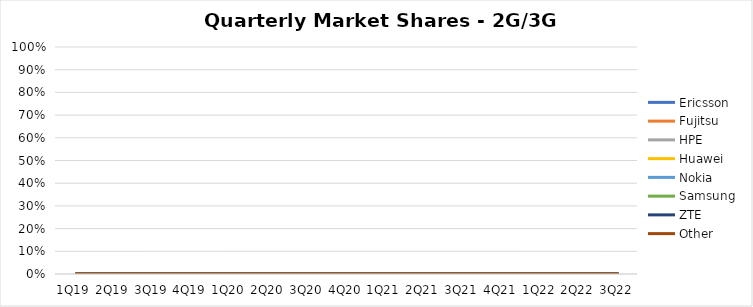
| Category | Ericsson | Fujitsu | HPE | Huawei | Nokia | Samsung | ZTE | Other |
|---|---|---|---|---|---|---|---|---|
| 1Q19 | 0 | 0 | 0 | 0 | 0 | 0 | 0 | 0 |
| 2Q19 | 0 | 0 | 0 | 0 | 0 | 0 | 0 | 0 |
| 3Q19 | 0 | 0 | 0 | 0 | 0 | 0 | 0 | 0 |
| 4Q19 | 0 | 0 | 0 | 0 | 0 | 0 | 0 | 0 |
| 1Q20 | 0 | 0 | 0 | 0 | 0 | 0 | 0 | 0 |
| 2Q20 | 0 | 0 | 0 | 0 | 0 | 0 | 0 | 0 |
| 3Q20 | 0 | 0 | 0 | 0 | 0 | 0 | 0 | 0 |
| 4Q20 | 0 | 0 | 0 | 0 | 0 | 0 | 0 | 0 |
| 1Q21 | 0 | 0 | 0 | 0 | 0 | 0 | 0 | 0 |
| 2Q21 | 0 | 0 | 0 | 0 | 0 | 0 | 0 | 0 |
| 3Q21 | 0 | 0 | 0 | 0 | 0 | 0 | 0 | 0 |
| 4Q21 | 0 | 0 | 0 | 0 | 0 | 0 | 0 | 0 |
| 1Q22 | 0 | 0 | 0 | 0 | 0 | 0 | 0 | 0 |
| 2Q22 | 0 | 0 | 0 | 0 | 0 | 0 | 0 | 0 |
| 3Q22 | 0 | 0 | 0 | 0 | 0 | 0 | 0 | 0 |